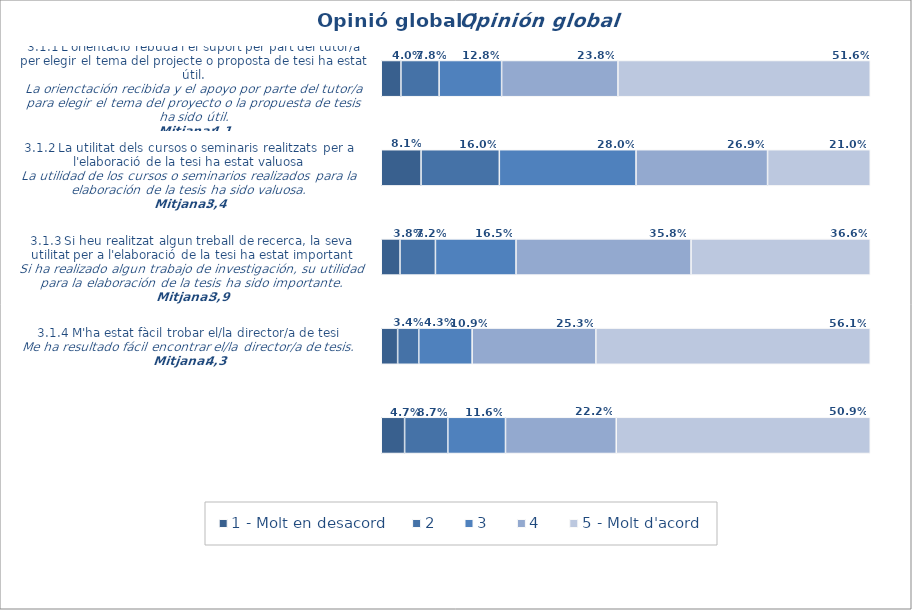
| Category | 1 - Molt en desacord | 2 | 3 | 4 | 5 - Molt d'acord |
|---|---|---|---|---|---|
| 1.0 | 0.04 | 0.078 | 0.128 | 0.238 | 0.516 |
| 2.0 | 0.081 | 0.16 | 0.28 | 0.269 | 0.21 |
| 3.0 | 0.038 | 0.072 | 0.165 | 0.358 | 0.366 |
| 4.0 | 0.034 | 0.043 | 0.109 | 0.253 | 0.561 |
| 5.0 | 0.047 | 0.087 | 0.116 | 0.222 | 0.509 |